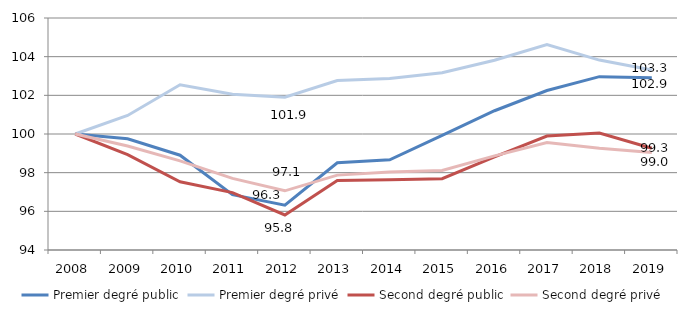
| Category | Premier degré public | Premier degré privé | Second degré public | Second degré privé |
|---|---|---|---|---|
| 2008.0 | 100 | 100 | 100 | 100 |
| 2009.0 | 99.752 | 100.961 | 98.928 | 99.378 |
| 2010.0 | 98.902 | 102.548 | 97.528 | 98.609 |
| 2011.0 | 96.863 | 102.055 | 96.968 | 97.704 |
| 2012.0 | 96.314 | 101.907 | 95.814 | 97.061 |
| 2013.0 | 98.51 | 102.764 | 97.594 | 97.873 |
| 2014.0 | 98.662 | 102.868 | 97.634 | 98.032 |
| 2015.0 | 99.928 | 103.167 | 97.688 | 98.109 |
| 2016.0 | 101.203 | 103.815 | 98.822 | 98.867 |
| 2017.0 | 102.248 | 104.63 | 99.897 | 99.558 |
| 2018.0 | 102.967 | 103.824 | 100.052 | 99.261 |
| 2019.0 | 102.916 | 103.306 | 99.262 | 99.044 |